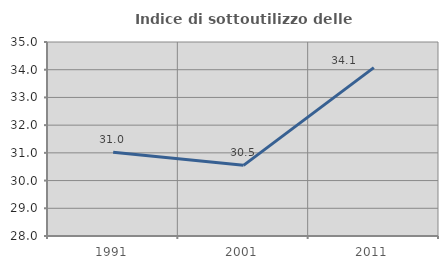
| Category | Indice di sottoutilizzo delle abitazioni  |
|---|---|
| 1991.0 | 31.025 |
| 2001.0 | 30.549 |
| 2011.0 | 34.077 |